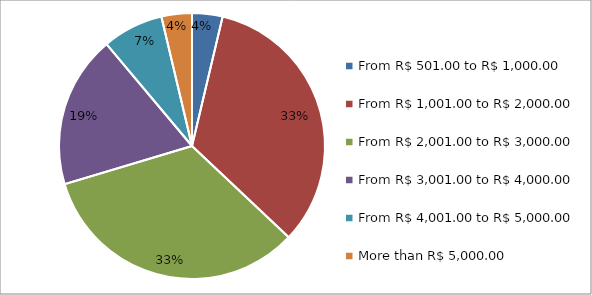
| Category | Series 0 |
|---|---|
| From R$ 501.00 to R$ 1,000.00 | 1 |
| From R$ 1,001.00 to R$ 2,000.00 | 9 |
| From R$ 2,001.00 to R$ 3,000.00 | 9 |
| From R$ 3,001.00 to R$ 4,000.00 | 5 |
| From R$ 4,001.00 to R$ 5,000.00 | 2 |
| More than R$ 5,000.00 | 1 |